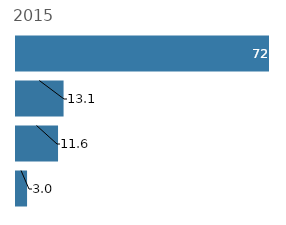
| Category | Series 0 |
|---|---|
| 0 | 3.049 |
| 1 | 11.585 |
| 2 | 13.11 |
| 3 | 72.256 |